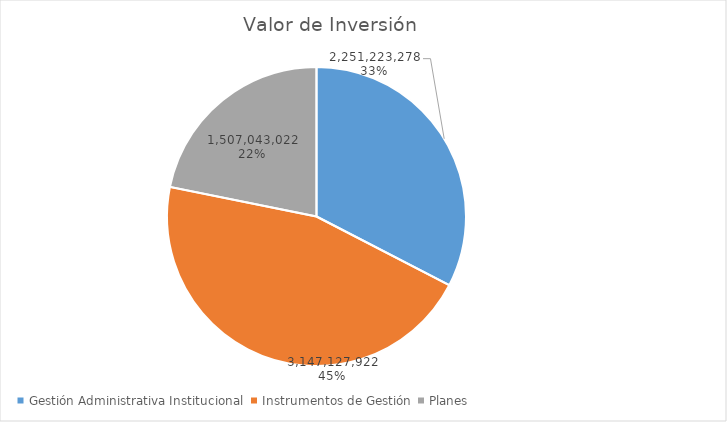
| Category | Valor de Inversión | Porcentaje de Ejecución dentro de la Actividad |
|---|---|---|
| Gestión Administrativa Institucional | 2251223278 | 6 |
| Instrumentos de Gestión | 3147127922 | 11 |
| Planes | 1507043022 | 13 |